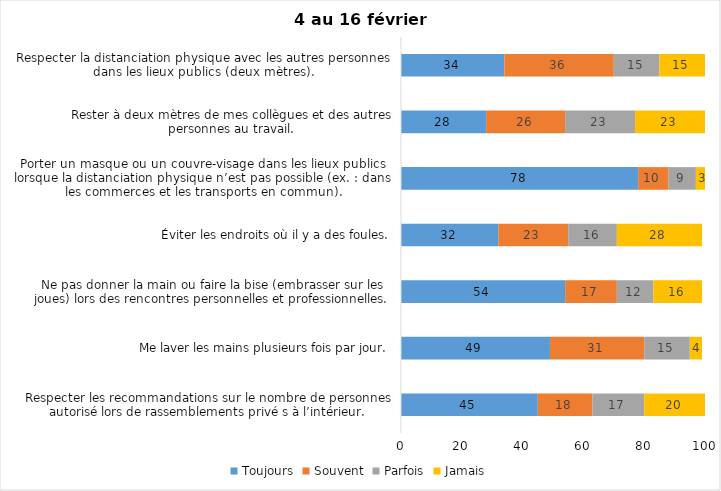
| Category | Toujours | Souvent | Parfois | Jamais |
|---|---|---|---|---|
| Respecter les recommandations sur le nombre de personnes autorisé lors de rassemblements privé s à l’intérieur. | 45 | 18 | 17 | 20 |
| Me laver les mains plusieurs fois par jour. | 49 | 31 | 15 | 4 |
| Ne pas donner la main ou faire la bise (embrasser sur les joues) lors des rencontres personnelles et professionnelles. | 54 | 17 | 12 | 16 |
| Éviter les endroits où il y a des foules. | 32 | 23 | 16 | 28 |
| Porter un masque ou un couvre-visage dans les lieux publics lorsque la distanciation physique n’est pas possible (ex. : dans les commerces et les transports en commun). | 78 | 10 | 9 | 3 |
| Rester à deux mètres de mes collègues et des autres personnes au travail. | 28 | 26 | 23 | 23 |
| Respecter la distanciation physique avec les autres personnes dans les lieux publics (deux mètres). | 34 | 36 | 15 | 15 |